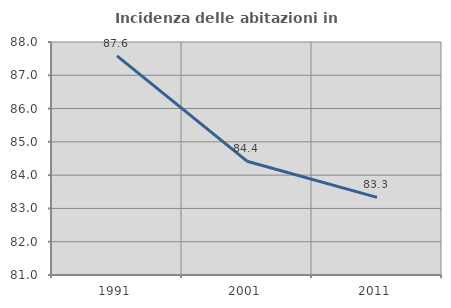
| Category | Incidenza delle abitazioni in proprietà  |
|---|---|
| 1991.0 | 87.582 |
| 2001.0 | 84.419 |
| 2011.0 | 83.333 |